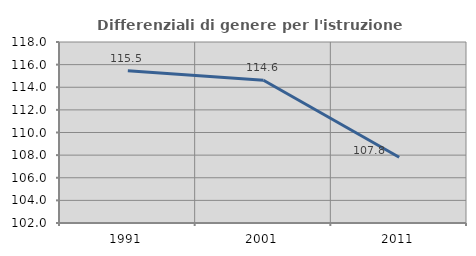
| Category | Differenziali di genere per l'istruzione superiore |
|---|---|
| 1991.0 | 115.451 |
| 2001.0 | 114.614 |
| 2011.0 | 107.806 |